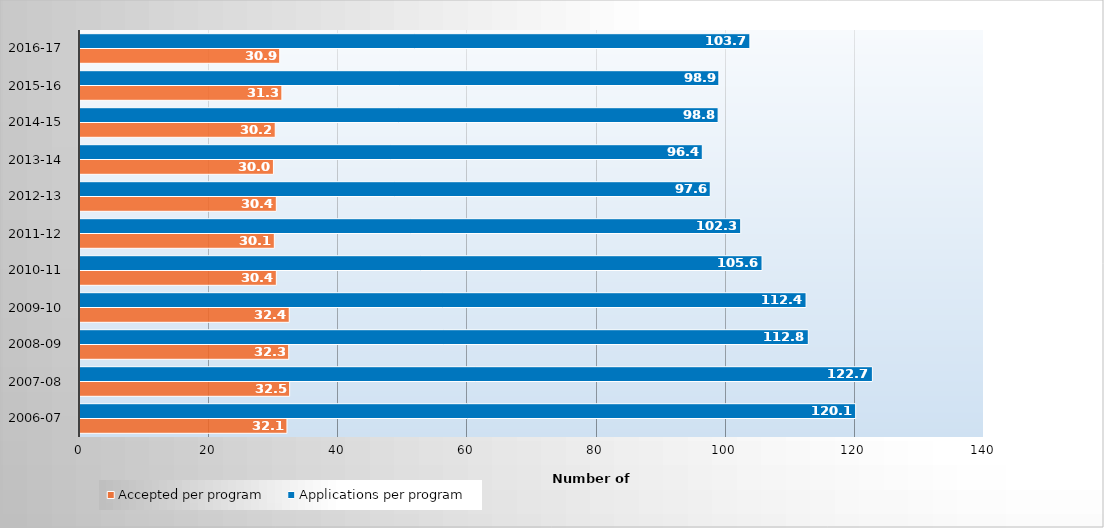
| Category | Accepted per program | Applications per program |
|---|---|---|
| 2006-07 | 32.052 | 120.126 |
| 2007-08 | 32.468 | 122.717 |
| 2008-09 | 32.326 | 112.791 |
| 2009-10 | 32.405 | 112.443 |
| 2010-11 | 30.406 | 105.625 |
| 2011-12 | 30.096 | 102.325 |
| 2012-13 | 30.403 | 97.603 |
| 2013-14 | 29.955 | 96.374 |
| 2014-15 | 30.236 | 98.827 |
| 2015-16 | 31.266 | 98.937 |
| 2016-17 | 30.93 | 103.739 |